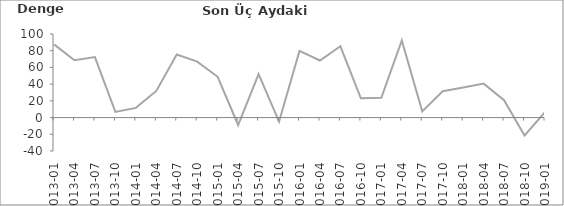
| Category | Son Üç Aydaki Karlılık |
|---|---|
| 2013-01 | 87.6 |
| 2013-04 | 68.6 |
| 2013-07 | 72.4 |
| 2013-10 | 6.8 |
| 2014-01 | 11.6 |
| 2014-04 | 31.9 |
| 2014-07 | 75.4 |
| 2014-10 | 67 |
| 2015-01 | 48.8 |
| 2015-04 | -8.9 |
| 2015-07 | 51.9 |
| 2015-10 | -4.9 |
| 2016-01 | 79.8 |
| 2016-04 | 68.3 |
| 2016-07 | 85.3 |
| 2016-10 | 23.1 |
| 2017-01 | 23.6 |
| 2017-04 | 92.3 |
| 2017-07 | 7.4 |
| 2017-10 | 31.5 |
| 2018-01 | 35.9 |
| 2018-04 | 40.6 |
| 2018-07 | 20.8 |
| 2018-10 | -21.4 |
| 2019-01 | 6.4 |